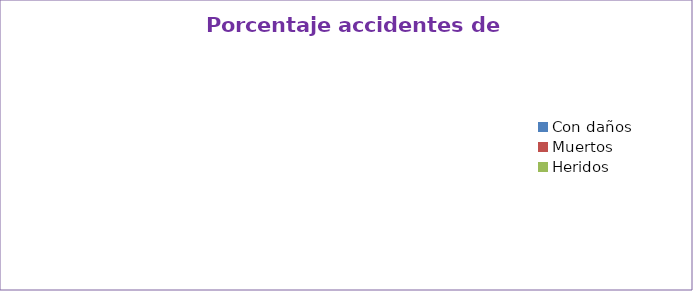
| Category | Series 0 |
|---|---|
| Con daños  | 0 |
| Muertos  | 0 |
| Heridos  | 0 |